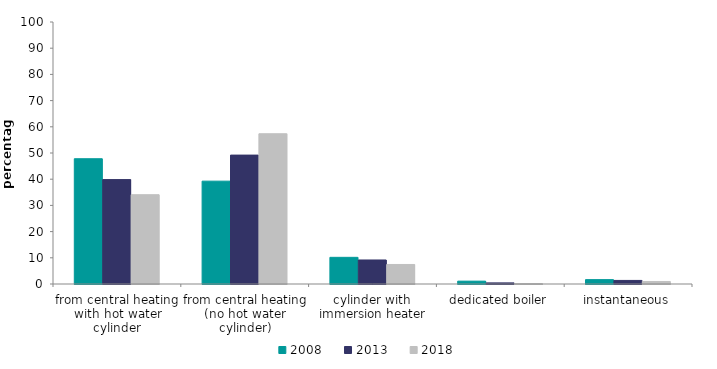
| Category | 2008 | 2013 | 2018 |
|---|---|---|---|
| from central heating with hot water cylinder | 47.811 | 39.85 | 34.083 |
| from central heating (no hot water cylinder) | 39.256 | 49.198 | 57.345 |
| cylinder with immersion heater | 10.178 | 9.167 | 7.452 |
| dedicated boiler | 1.087 | 0.421 | 0.155 |
| instantaneous | 1.667 | 1.364 | 0.965 |